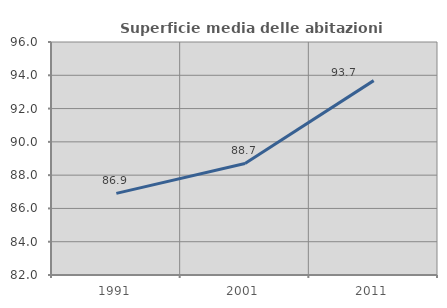
| Category | Superficie media delle abitazioni occupate |
|---|---|
| 1991.0 | 86.906 |
| 2001.0 | 88.701 |
| 2011.0 | 93.679 |